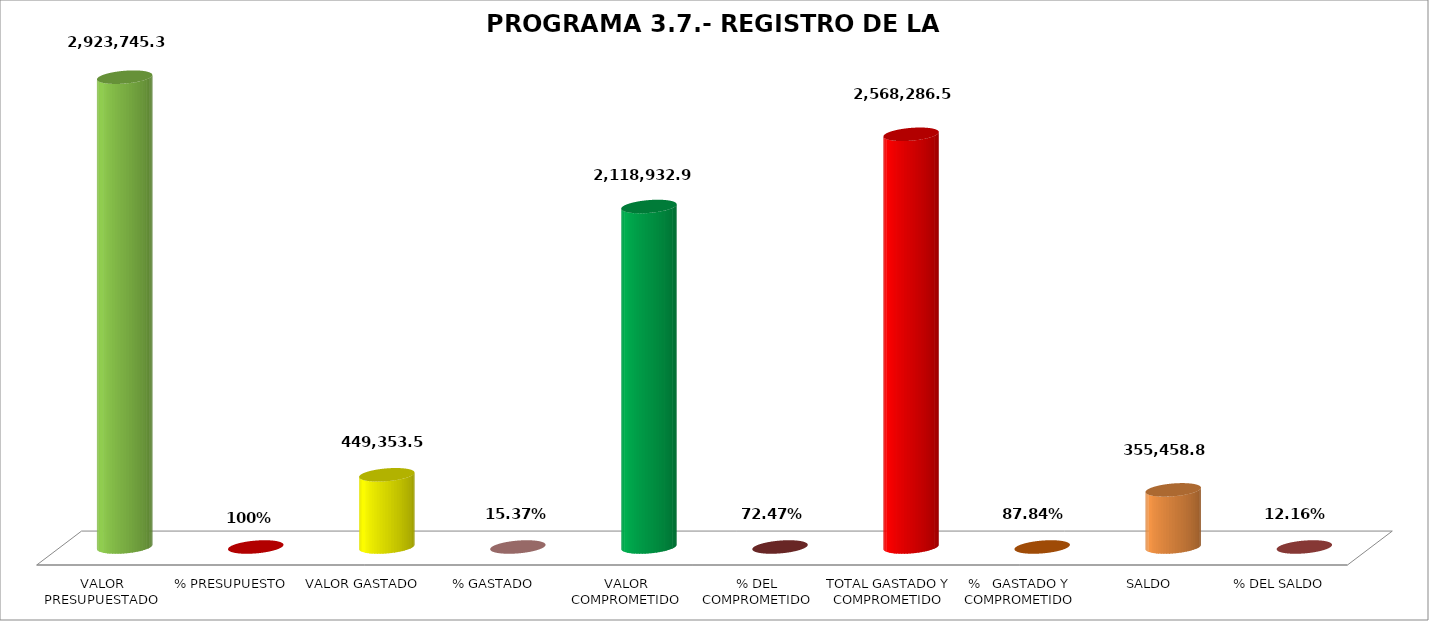
| Category | PROGRAMA 3.7.- REGISTRO DE LA PROPIEDAD |
|---|---|
| VALOR PRESUPUESTADO | 2923745.38 |
| % PRESUPUESTO | 1 |
| VALOR GASTADO | 449353.59 |
| % GASTADO | 0.154 |
| VALOR COMPROMETIDO | 2118932.95 |
| % DEL COMPROMETIDO | 0.725 |
| TOTAL GASTADO Y COMPROMETIDO | 2568286.54 |
| %   GASTADO Y COMPROMETIDO | 0.878 |
| SALDO | 355458.84 |
| % DEL SALDO | 0.122 |